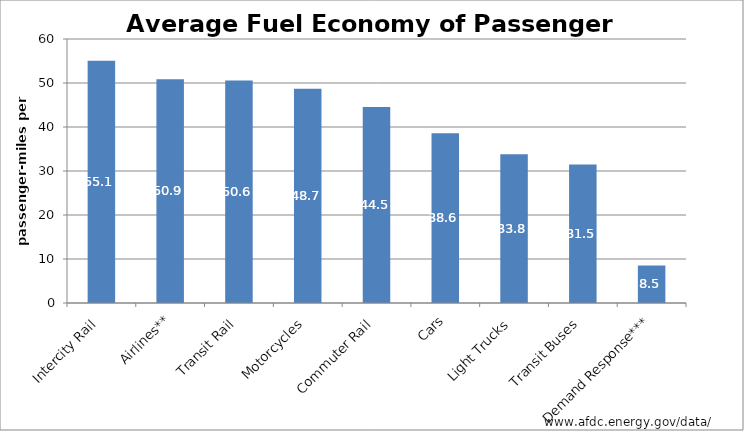
| Category | Series 0 |
|---|---|
| Intercity Rail | 55.081 |
| Airlines** | 50.854 |
| Transit Rail | 50.593 |
| Motorcycles | 48.706 |
| Commuter Rail | 44.534 |
| Cars | 38.593 |
| Light Trucks | 33.816 |
| Transit Buses | 31.46 |
| Demand Response*** | 8.535 |